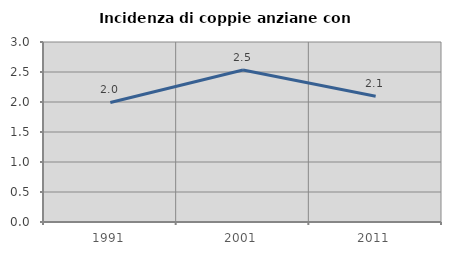
| Category | Incidenza di coppie anziane con figli |
|---|---|
| 1991.0 | 1.993 |
| 2001.0 | 2.533 |
| 2011.0 | 2.097 |